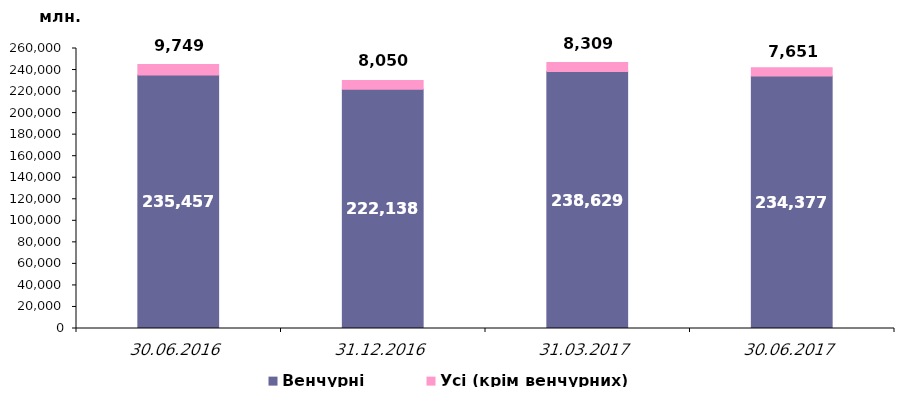
| Category | Венчурні | Усі (крім венчурних) |
|---|---|---|
| 30.06.2016 | 235457.159 | 9749.17 |
| 31.12.2016 | 222138.472 | 8049.531 |
| 31.03.2017 | 238628.798 | 8309.226 |
| 30.06.2017 | 234376.575 | 7650.878 |